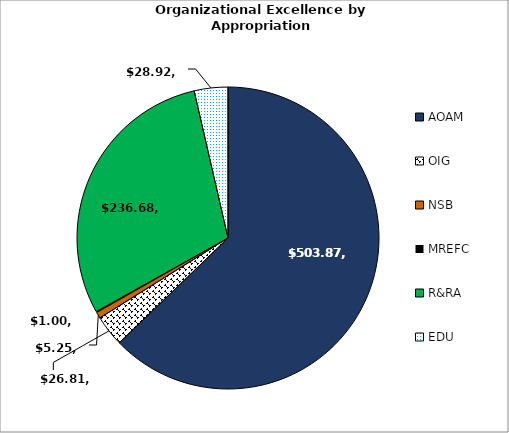
| Category | FY 2024 Organizational Excellence by Appropriation |
|---|---|
| AOAM | 503.87 |
| OIG | 26.81 |
| NSB | 5.25 |
| MREFC | 1 |
| R&RA | 236.68 |
| EDU | 28.92 |